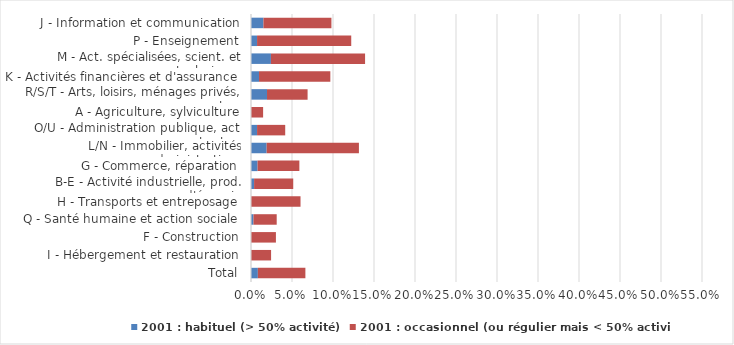
| Category | 2001 : habituel (> 50% activité) | 2001 : occasionnel (ou régulier mais < 50% activité) |
|---|---|---|
| Total | 0.008 | 0.058 |
| I - Hébergement et restauration | 0 | 0.024 |
| F - Construction | 0 | 0.03 |
| Q - Santé humaine et action sociale | 0.003 | 0.028 |
| H - Transports et entreposage | 0 | 0.06 |
| B-E - Activité industrielle, prod. d'énergie | 0.004 | 0.048 |
| G - Commerce, réparation | 0.008 | 0.051 |
| L/N - Immobilier, activités administratives | 0.019 | 0.113 |
| O/U - Administration publique, act. extra-ter. | 0.007 | 0.034 |
| A - Agriculture, sylviculture | 0 | 0.015 |
| R/S/T - Arts, loisirs, ménages privés, autres | 0.02 | 0.049 |
| K - Activités financières et d'assurance | 0.01 | 0.087 |
| M - Act. spécialisées, scient. et techniques | 0.024 | 0.115 |
| P - Enseignement | 0.007 | 0.115 |
| J - Information et communication | 0.015 | 0.083 |